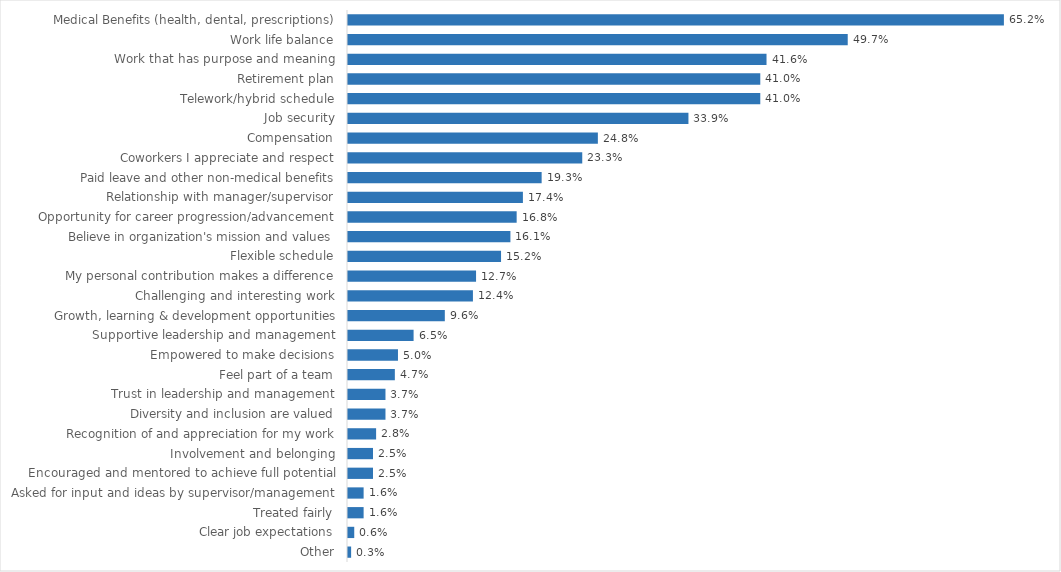
| Category | Health |
|---|---|
| Medical Benefits (health, dental, prescriptions) | 0.652 |
| Work life balance | 0.497 |
| Work that has purpose and meaning | 0.416 |
| Retirement plan | 0.41 |
| Telework/hybrid schedule | 0.41 |
| Job security | 0.339 |
| Compensation | 0.248 |
| Coworkers I appreciate and respect | 0.233 |
| Paid leave and other non-medical benefits | 0.193 |
| Relationship with manager/supervisor | 0.174 |
| Opportunity for career progression/advancement | 0.168 |
| Believe in organization's mission and values | 0.161 |
| Flexible schedule | 0.152 |
| My personal contribution makes a difference | 0.127 |
| Challenging and interesting work | 0.124 |
| Growth, learning & development opportunities | 0.096 |
| Supportive leadership and management | 0.065 |
| Empowered to make decisions | 0.05 |
| Feel part of a team | 0.047 |
| Trust in leadership and management | 0.037 |
| Diversity and inclusion are valued | 0.037 |
| Recognition of and appreciation for my work | 0.028 |
| Involvement and belonging | 0.025 |
| Encouraged and mentored to achieve full potential | 0.025 |
| Asked for input and ideas by supervisor/management | 0.016 |
| Treated fairly | 0.016 |
| Clear job expectations | 0.006 |
| Other | 0.003 |